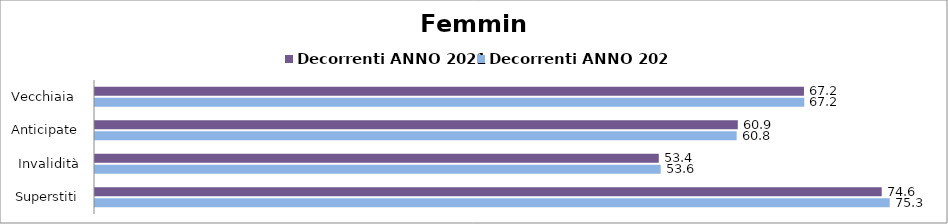
| Category | Decorrenti ANNO 2021 | Decorrenti ANNO 2022 |
|---|---|---|
| Vecchiaia  | 67.2 | 67.23 |
| Anticipate | 60.93 | 60.82 |
| Invalidità | 53.44 | 53.62 |
| Superstiti | 74.57 | 75.33 |